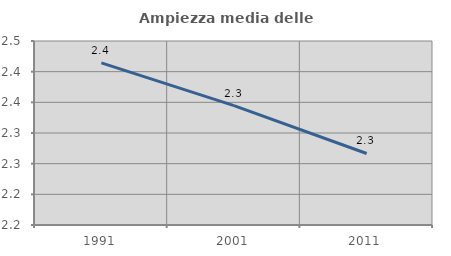
| Category | Ampiezza media delle famiglie |
|---|---|
| 1991.0 | 2.414 |
| 2001.0 | 2.345 |
| 2011.0 | 2.267 |